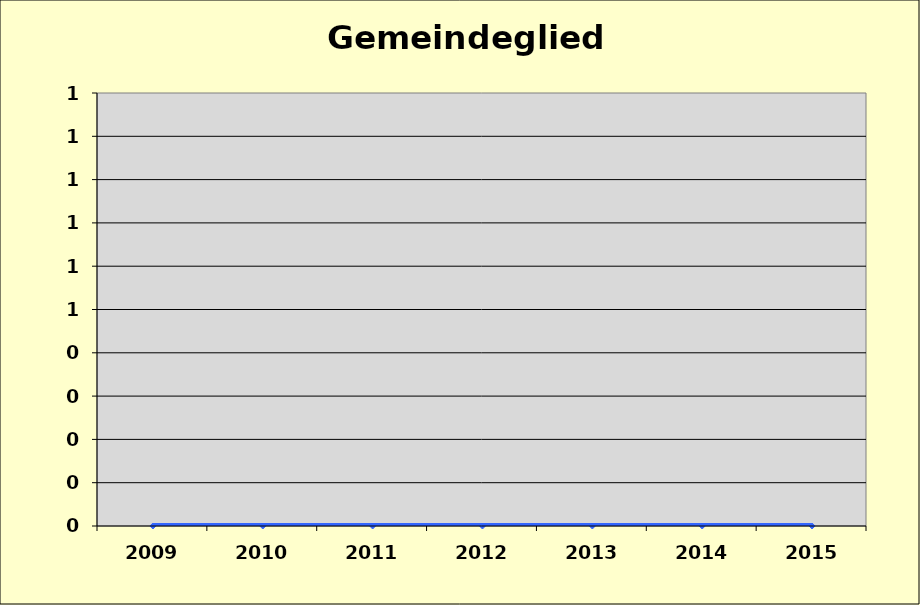
| Category | Series 0 |
|---|---|
| 2009.0 | 0 |
| 2010.0 | 0 |
| 2011.0 | 0 |
| 2012.0 | 0 |
| 2013.0 | 0 |
| 2014.0 | 0 |
| 2015.0 | 0 |